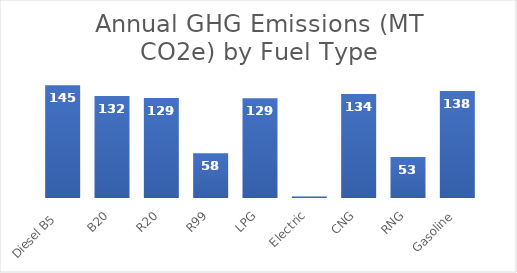
| Category | Series 0 |
|---|---|
| Diesel B5  | 145.475 |
| B20 | 131.606 |
| R20 | 128.993 |
| R99 | 57.587 |
| LPG | 128.823 |
| Electric | 1.899 |
| CNG | 134.06 |
| RNG | 52.975 |
| Gasoline | 138.105 |